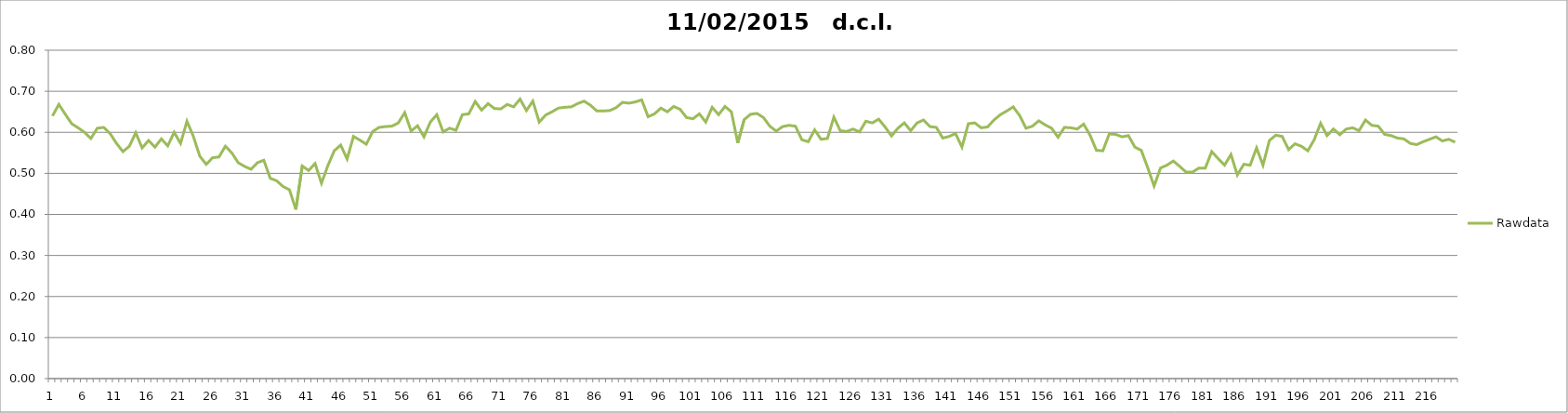
| Category | Rawdata |
|---|---|
| 0 | 0.64 |
| 1 | 0.668 |
| 2 | 0.644 |
| 3 | 0.621 |
| 4 | 0.611 |
| 5 | 0.6 |
| 6 | 0.585 |
| 7 | 0.61 |
| 8 | 0.612 |
| 9 | 0.597 |
| 10 | 0.573 |
| 11 | 0.553 |
| 12 | 0.566 |
| 13 | 0.599 |
| 14 | 0.562 |
| 15 | 0.58 |
| 16 | 0.564 |
| 17 | 0.584 |
| 18 | 0.567 |
| 19 | 0.6 |
| 20 | 0.573 |
| 21 | 0.627 |
| 22 | 0.59 |
| 23 | 0.542 |
| 24 | 0.522 |
| 25 | 0.538 |
| 26 | 0.54 |
| 27 | 0.566 |
| 28 | 0.55 |
| 29 | 0.526 |
| 30 | 0.517 |
| 31 | 0.51 |
| 32 | 0.526 |
| 33 | 0.532 |
| 34 | 0.488 |
| 35 | 0.482 |
| 36 | 0.468 |
| 37 | 0.46 |
| 38 | 0.412 |
| 39 | 0.518 |
| 40 | 0.507 |
| 41 | 0.524 |
| 42 | 0.476 |
| 43 | 0.519 |
| 44 | 0.555 |
| 45 | 0.569 |
| 46 | 0.535 |
| 47 | 0.59 |
| 48 | 0.581 |
| 49 | 0.571 |
| 50 | 0.602 |
| 51 | 0.612 |
| 52 | 0.614 |
| 53 | 0.615 |
| 54 | 0.623 |
| 55 | 0.648 |
| 56 | 0.603 |
| 57 | 0.616 |
| 58 | 0.589 |
| 59 | 0.625 |
| 60 | 0.643 |
| 61 | 0.601 |
| 62 | 0.61 |
| 63 | 0.605 |
| 64 | 0.643 |
| 65 | 0.645 |
| 66 | 0.675 |
| 67 | 0.654 |
| 68 | 0.67 |
| 69 | 0.658 |
| 70 | 0.657 |
| 71 | 0.668 |
| 72 | 0.662 |
| 73 | 0.681 |
| 74 | 0.653 |
| 75 | 0.676 |
| 76 | 0.625 |
| 77 | 0.642 |
| 78 | 0.65 |
| 79 | 0.659 |
| 80 | 0.661 |
| 81 | 0.662 |
| 82 | 0.67 |
| 83 | 0.676 |
| 84 | 0.666 |
| 85 | 0.652 |
| 86 | 0.652 |
| 87 | 0.653 |
| 88 | 0.66 |
| 89 | 0.673 |
| 90 | 0.671 |
| 91 | 0.674 |
| 92 | 0.679 |
| 93 | 0.638 |
| 94 | 0.645 |
| 95 | 0.659 |
| 96 | 0.65 |
| 97 | 0.663 |
| 98 | 0.656 |
| 99 | 0.636 |
| 100 | 0.633 |
| 101 | 0.645 |
| 102 | 0.625 |
| 103 | 0.661 |
| 104 | 0.643 |
| 105 | 0.663 |
| 106 | 0.65 |
| 107 | 0.574 |
| 108 | 0.631 |
| 109 | 0.644 |
| 110 | 0.646 |
| 111 | 0.636 |
| 112 | 0.615 |
| 113 | 0.603 |
| 114 | 0.614 |
| 115 | 0.617 |
| 116 | 0.615 |
| 117 | 0.582 |
| 118 | 0.577 |
| 119 | 0.606 |
| 120 | 0.583 |
| 121 | 0.585 |
| 122 | 0.637 |
| 123 | 0.604 |
| 124 | 0.602 |
| 125 | 0.608 |
| 126 | 0.601 |
| 127 | 0.627 |
| 128 | 0.623 |
| 129 | 0.632 |
| 130 | 0.613 |
| 131 | 0.591 |
| 132 | 0.61 |
| 133 | 0.623 |
| 134 | 0.604 |
| 135 | 0.623 |
| 136 | 0.63 |
| 137 | 0.614 |
| 138 | 0.612 |
| 139 | 0.586 |
| 140 | 0.59 |
| 141 | 0.597 |
| 142 | 0.564 |
| 143 | 0.621 |
| 144 | 0.623 |
| 145 | 0.611 |
| 146 | 0.613 |
| 147 | 0.63 |
| 148 | 0.643 |
| 149 | 0.652 |
| 150 | 0.662 |
| 151 | 0.641 |
| 152 | 0.61 |
| 153 | 0.615 |
| 154 | 0.628 |
| 155 | 0.618 |
| 156 | 0.61 |
| 157 | 0.588 |
| 158 | 0.612 |
| 159 | 0.611 |
| 160 | 0.608 |
| 161 | 0.62 |
| 162 | 0.593 |
| 163 | 0.556 |
| 164 | 0.555 |
| 165 | 0.596 |
| 166 | 0.595 |
| 167 | 0.589 |
| 168 | 0.592 |
| 169 | 0.564 |
| 170 | 0.556 |
| 171 | 0.514 |
| 172 | 0.469 |
| 173 | 0.513 |
| 174 | 0.52 |
| 175 | 0.53 |
| 176 | 0.517 |
| 177 | 0.503 |
| 178 | 0.503 |
| 179 | 0.513 |
| 180 | 0.513 |
| 181 | 0.553 |
| 182 | 0.536 |
| 183 | 0.52 |
| 184 | 0.546 |
| 185 | 0.496 |
| 186 | 0.522 |
| 187 | 0.52 |
| 188 | 0.562 |
| 189 | 0.52 |
| 190 | 0.58 |
| 191 | 0.593 |
| 192 | 0.59 |
| 193 | 0.558 |
| 194 | 0.572 |
| 195 | 0.566 |
| 196 | 0.555 |
| 197 | 0.582 |
| 198 | 0.622 |
| 199 | 0.592 |
| 200 | 0.608 |
| 201 | 0.594 |
| 202 | 0.608 |
| 203 | 0.611 |
| 204 | 0.604 |
| 205 | 0.63 |
| 206 | 0.617 |
| 207 | 0.615 |
| 208 | 0.595 |
| 209 | 0.592 |
| 210 | 0.586 |
| 211 | 0.584 |
| 212 | 0.573 |
| 213 | 0.57 |
| 214 | 0.577 |
| 215 | 0.583 |
| 216 | 0.589 |
| 217 | 0.579 |
| 218 | 0.583 |
| 219 | 0.576 |